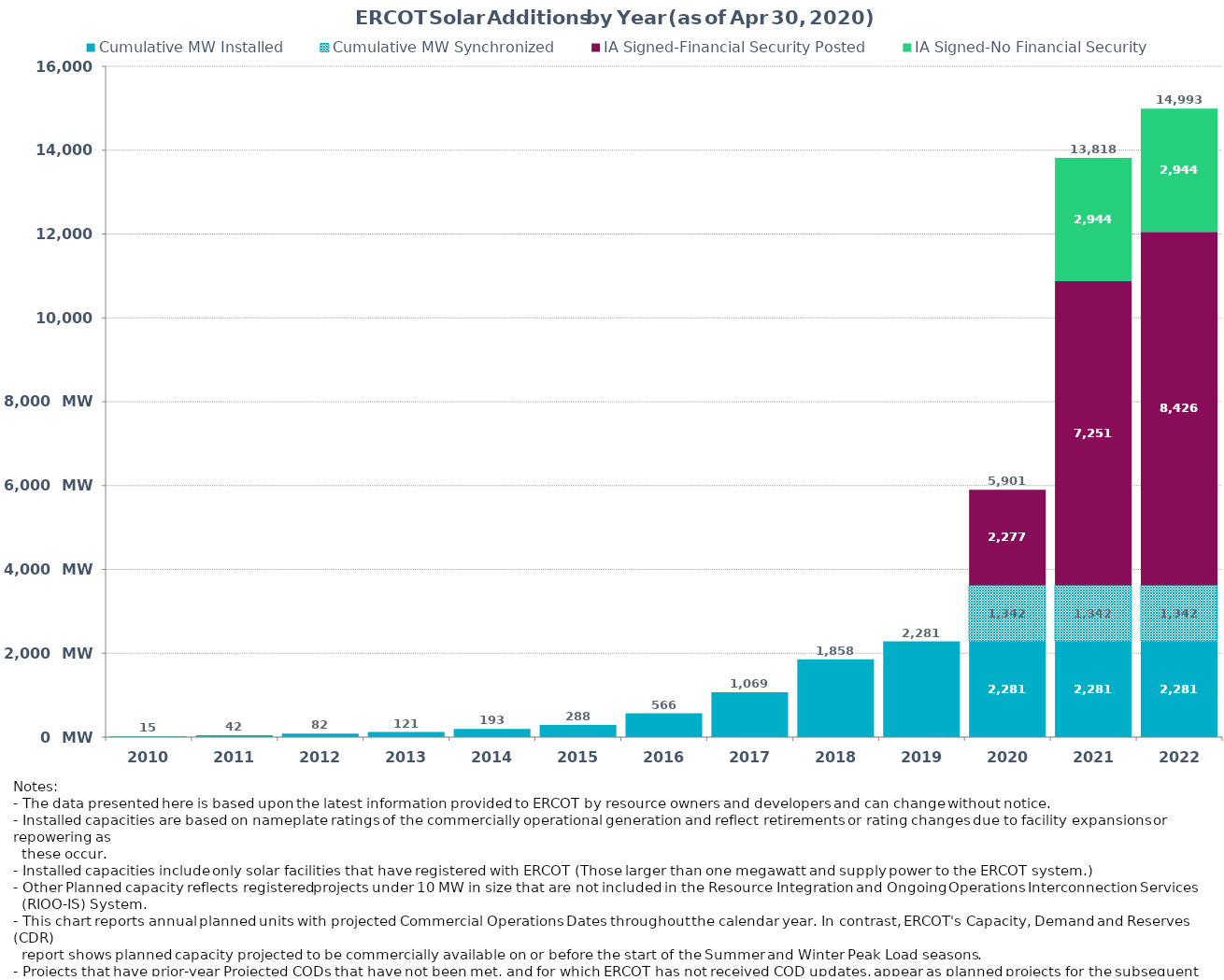
| Category | Cumulative MW Installed | Cumulative MW Synchronized | IA Signed-Financial Security Posted  | IA Signed-No Financial Security  | Other Planned | Cumulative Installed and Planned |
|---|---|---|---|---|---|---|
| 2010.0 | 15 | 0 | 0 | 0 | 0 | 15 |
| 2011.0 | 42 | 0 | 0 | 0 | 0 | 42 |
| 2012.0 | 82 | 0 | 0 | 0 | 0 | 82 |
| 2013.0 | 121 | 0 | 0 | 0 | 0 | 121 |
| 2014.0 | 193 | 0 | 0 | 0 | 0 | 193 |
| 2015.0 | 287.7 | 0 | 0 | 0 | 0 | 287.7 |
| 2016.0 | 566.4 | 0 | 0 | 0 | 0 | 566.4 |
| 2017.0 | 1068.7 | 0 | 0 | 0 | 0 | 1068.7 |
| 2018.0 | 1857.7 | 0 | 0 | 0 | 0 | 1857.7 |
| 2019.0 | 2281.4 | 0 | 0 | 0 | 0 | 2281.4 |
| 2020.0 | 2281.42 | 1342 | 2277.27 | 0 | 0 | 5900.69 |
| 2021.0 | 2281.42 | 1342 | 7251.44 | 2943.63 | 0 | 13818.49 |
| 2022.0 | 2281.42 | 1342 | 8425.99 | 2943.63 | 0 | 14993.04 |